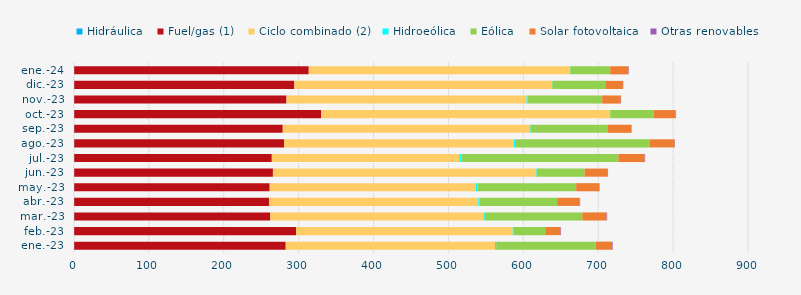
| Category | Hidráulica | Fuel/gas (1) | Ciclo combinado (2) | Hidroeólica | Eólica | Solar fotovoltaica | Otras renovables |
|---|---|---|---|---|---|---|---|
| ene.-23 | 0.275 | 282.444 | 279.419 | 1.65 | 132.728 | 22.121 | 0.784 |
| feb.-23 | 0.254 | 296.212 | 289.333 | 0.829 | 42.671 | 20.383 | 0.711 |
| mar.-23 | 0.282 | 261.841 | 284.831 | 1.572 | 130.237 | 32.429 | 0.738 |
| abr.-23 | 0.276 | 260.1 | 279.544 | 1.573 | 103.686 | 30.034 | 0.631 |
| may.-23 | 0.298 | 261.008 | 275.341 | 2.067 | 131.849 | 30.564 | 0.651 |
| jun.-23 | 0.284 | 265.329 | 351.459 | 0.809 | 63.875 | 30.692 | 0.665 |
| jul.-23 | 0.302 | 263.817 | 250.521 | 2.759 | 209.601 | 35.003 | 0.646 |
| ago.-23 | 0.29 | 280.25 | 306.931 | 2.7 | 178.402 | 33.602 | 0.375 |
| sep.-23 | 0.289 | 278.469 | 329.651 | 1.315 | 103.233 | 31.322 | 0.372 |
| oct.-23 | 0.303 | 329.853 | 385.374 | 0.443 | 57.759 | 29.7 | 0.524 |
| nov.-23 | 0.28 | 283.46 | 320.608 | 1.09 | 99.873 | 24.842 | 0.425 |
| dic.-23 | 0.306 | 293.933 | 343.705 | 0.669 | 70.816 | 23.549 | 0.445 |
| ene.-24 | 0.296 | 313.174 | 348.608 | 0.668 | 53.196 | 24.433 | 0.5 |